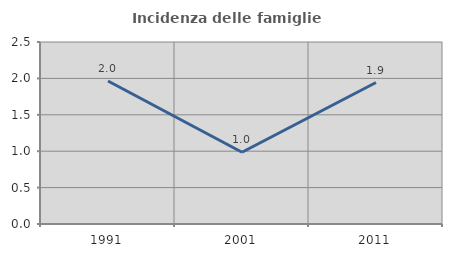
| Category | Incidenza delle famiglie numerose |
|---|---|
| 1991.0 | 1.964 |
| 2001.0 | 0.985 |
| 2011.0 | 1.943 |